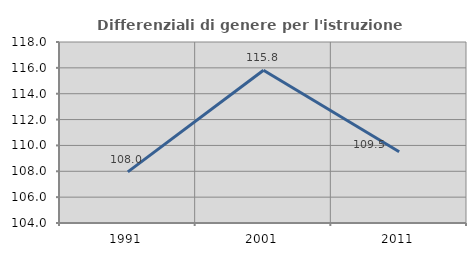
| Category | Differenziali di genere per l'istruzione superiore |
|---|---|
| 1991.0 | 107.951 |
| 2001.0 | 115.817 |
| 2011.0 | 109.505 |